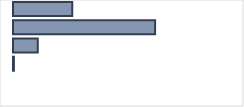
| Category | Series 0 |
|---|---|
| 0 | 26.1 |
| 1 | 62.6 |
| 2 | 10.9 |
| 3 | 0.4 |
| 4 | 0 |